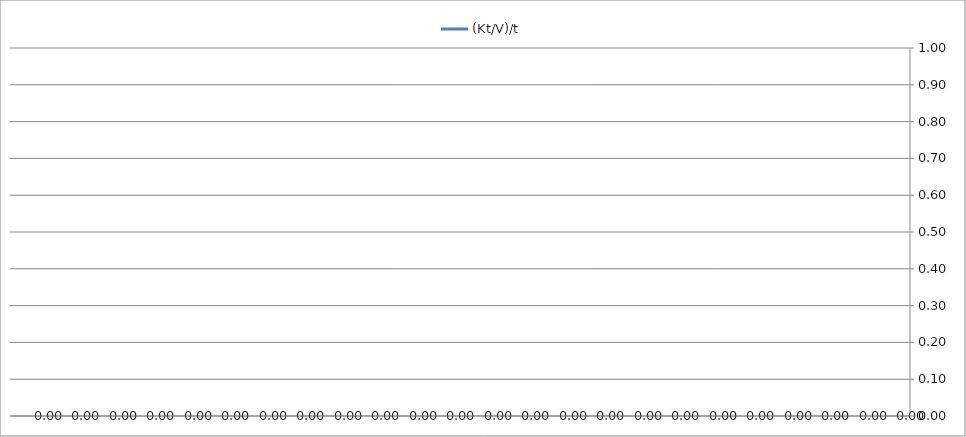
| Category | (Kt/V)/t |
|---|---|
|  | 0 |
|  | 0 |
|  | 0 |
|  | 0 |
|  | 0 |
|  | 0 |
|  | 0 |
|  | 0 |
|  | 0 |
|  | 0 |
|  | 0 |
|  | 0 |
|  | 0 |
|  | 0 |
|  | 0 |
|  | 0 |
|  | 0 |
|  | 0 |
|  | 0 |
|  | 0 |
|  | 0 |
|  | 0 |
|  | 0 |
|  | 0 |